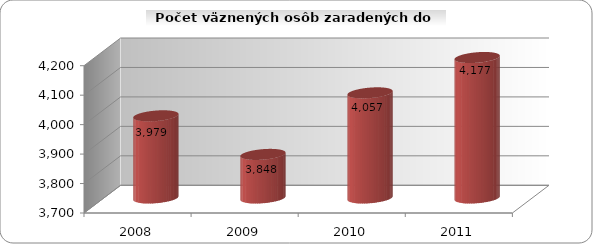
| Category | Series 1 |
|---|---|
| 2008.0 | 3979 |
| 2009.0 | 3848 |
| 2010.0 | 4057 |
| 2011.0 | 4177 |